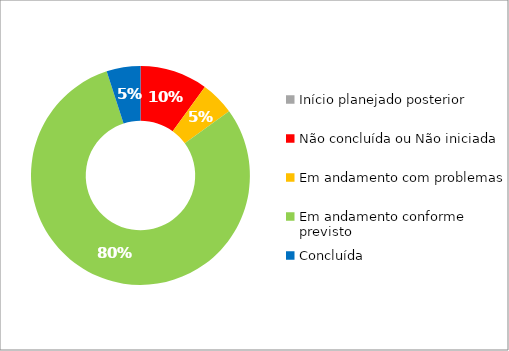
| Category | Series 0 |
|---|---|
| Início planejado posterior | 0 |
| Não concluída ou Não iniciada | 2 |
| Em andamento com problemas | 1 |
| Em andamento conforme previsto | 16 |
| Concluída | 1 |